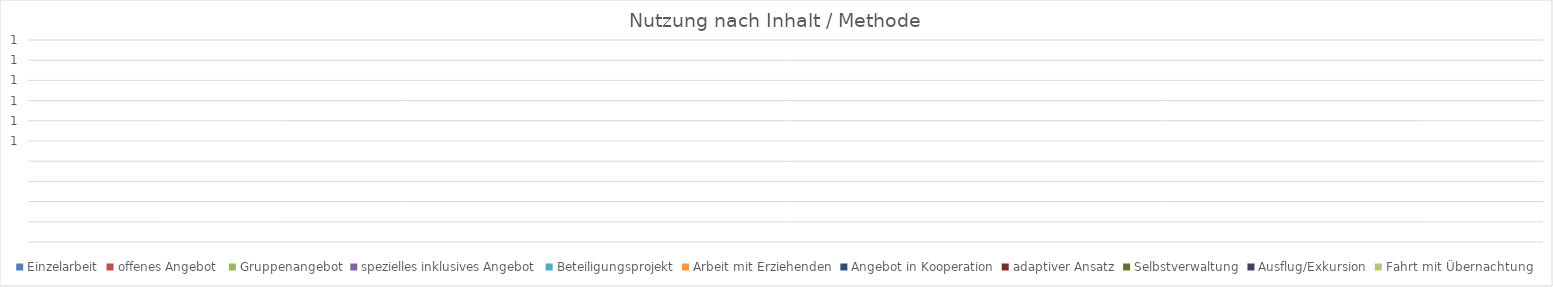
| Category | Einzelarbeit | offenes Angebot  | Gruppenangebot | spezielles inklusives Angebot | Beteiligungsprojekt | Arbeit mit Erziehenden | Angebot in Kooperation | adaptiver Ansatz | Selbstverwaltung | Ausflug/Exkursion | Fahrt mit Übernachtung |
|---|---|---|---|---|---|---|---|---|---|---|---|
| 0 | 0 | 0 | 0 | 0 | 0 | 0 | 0 | 0 | 0 | 0 | 0 |